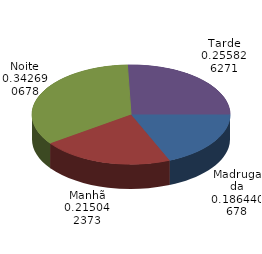
| Category | Qtde Vítimas |
|---|---|
| Madrugada | 352 |
| Manhã | 406 |
| Noite | 647 |
| Tarde | 483 |